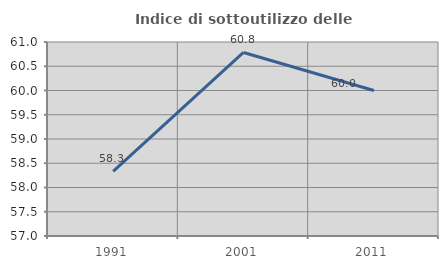
| Category | Indice di sottoutilizzo delle abitazioni  |
|---|---|
| 1991.0 | 58.333 |
| 2001.0 | 60.784 |
| 2011.0 | 60 |